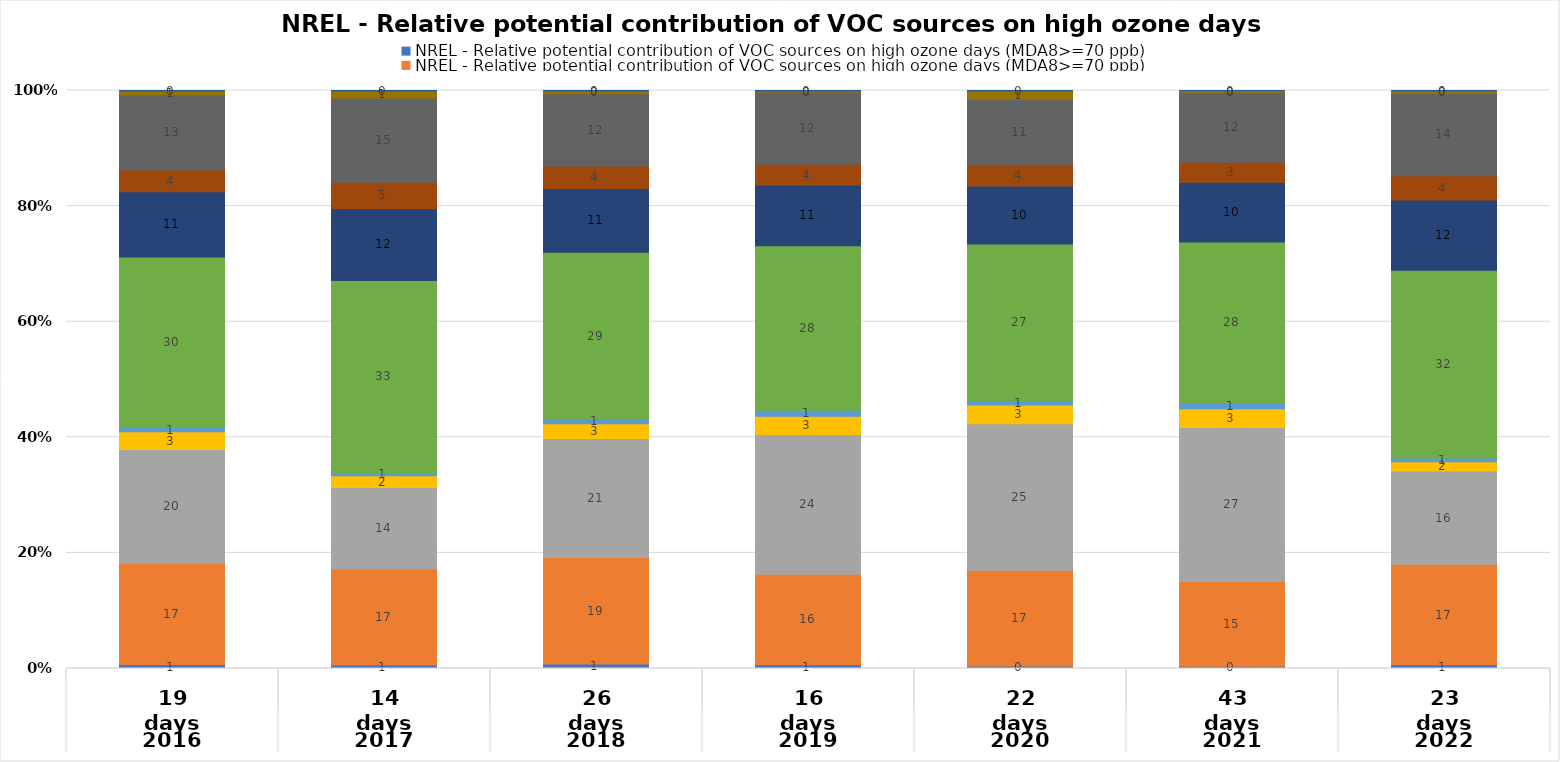
| Category | EGU Point | Non-EGU Point | O&G Area | O&G Point | O&G pre-production | Nonpoint | On-road Mobile | Other Non-road Mobile | Lawn & Garden Equipment | Airports | Rail |
|---|---|---|---|---|---|---|---|---|---|---|---|
| 0 | 0.683 | 17.497 | 19.719 | 3.046 | 0.756 | 29.509 | 11.267 | 3.761 | 13.025 | 0.671 | 0.066 |
| 1 | 0.585 | 16.616 | 14.103 | 2.065 | 0.53 | 33.244 | 12.438 | 4.558 | 14.562 | 1.231 | 0.069 |
| 2 | 0.764 | 18.505 | 20.515 | 2.582 | 0.776 | 28.895 | 10.988 | 3.933 | 12.479 | 0.484 | 0.079 |
| 3 | 0.652 | 15.665 | 24.161 | 3.144 | 1.04 | 28.474 | 10.515 | 3.578 | 12.491 | 0.211 | 0.07 |
| 4 | 0.437 | 16.572 | 25.345 | 3.222 | 0.774 | 27.099 | 10.048 | 3.636 | 11.368 | 1.431 | 0.068 |
| 5 | 0.389 | 14.678 | 26.65 | 3.215 | 1.011 | 27.866 | 10.297 | 3.46 | 12.138 | 0.235 | 0.062 |
| 6 | 0.629 | 17.417 | 16.117 | 1.593 | 0.657 | 32.489 | 12.173 | 4.19 | 14.251 | 0.406 | 0.077 |